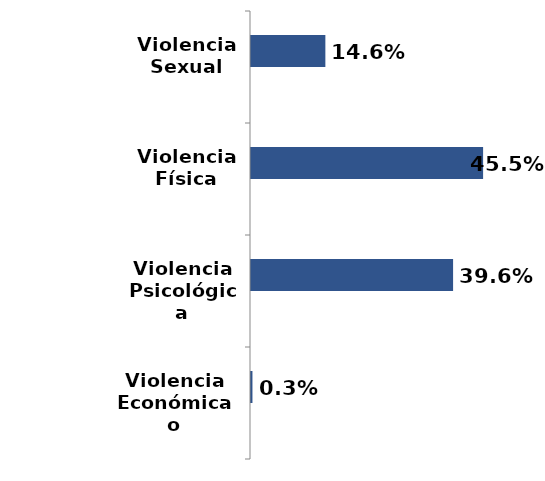
| Category | Series 0 | Series 1 |
|---|---|---|
| Violencia
Económica o Patrimonial |  | 0.003 |
| Violencia
Psicológica |  | 0.396 |
| Violencia
Física |  | 0.455 |
| Violencia
Sexual |  | 0.146 |